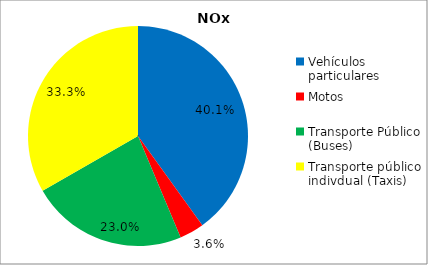
| Category | Series 0 |
|---|---|
| Vehículos particulares | 0.401 |
| Motos | 0.036 |
| Transporte Público (Buses) | 0.23 |
| Transporte público indivdual (Taxis) | 0.333 |